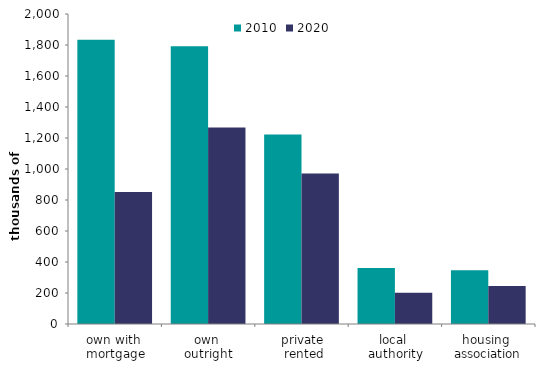
| Category | 2010 | 2020 |
|---|---|---|
| own with 
mortgage | 1834.249 | 851.549 |
| own 
outright | 1792.643 | 1267.42 |
| private
 rented | 1222.529 | 970.198 |
| local 
authority | 361.886 | 202.116 |
| housing 
association | 346.082 | 245.411 |